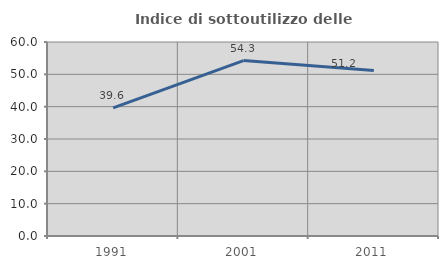
| Category | Indice di sottoutilizzo delle abitazioni  |
|---|---|
| 1991.0 | 39.628 |
| 2001.0 | 54.252 |
| 2011.0 | 51.212 |